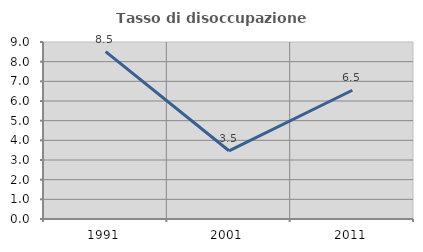
| Category | Tasso di disoccupazione giovanile  |
|---|---|
| 1991.0 | 8.511 |
| 2001.0 | 3.468 |
| 2011.0 | 6.548 |